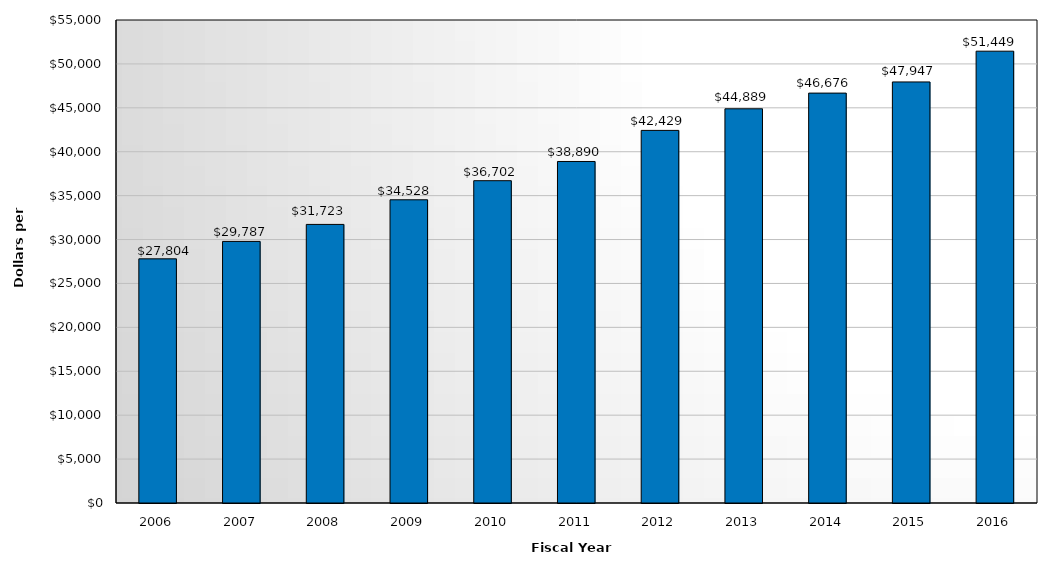
| Category | Tuition and Fees |
|---|---|
| 2006.0 | 27804 |
| 2007.0 | 29787 |
| 2008.0 | 31723 |
| 2009.0 | 34528 |
| 2010.0 | 36702 |
| 2011.0 | 38890 |
| 2012.0 | 42429 |
| 2013.0 | 44889 |
| 2014.0 | 46676 |
| 2015.0 | 47947 |
| 2016.0 | 51449 |